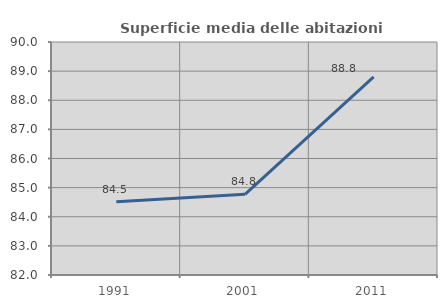
| Category | Superficie media delle abitazioni occupate |
|---|---|
| 1991.0 | 84.512 |
| 2001.0 | 84.771 |
| 2011.0 | 88.801 |